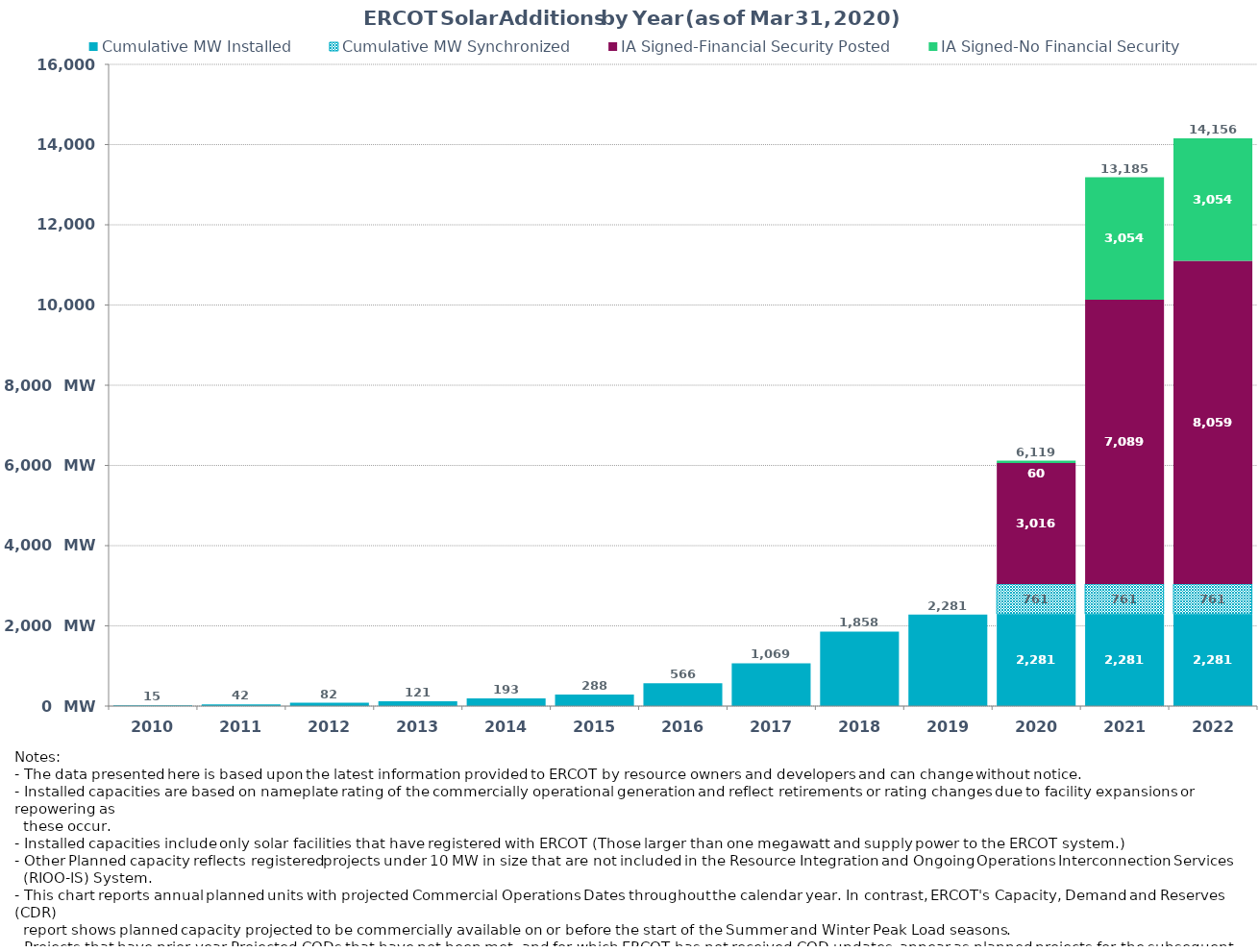
| Category | Cumulative MW Installed | Cumulative MW Synchronized | IA Signed-Financial Security Posted  | IA Signed-No Financial Security  | Other Planned | Cumulative Installed and Planned |
|---|---|---|---|---|---|---|
| 2010.0 | 15 | 0 | 0 | 0 | 0 | 15 |
| 2011.0 | 42 | 0 | 0 | 0 | 0 | 42 |
| 2012.0 | 82 | 0 | 0 | 0 | 0 | 82 |
| 2013.0 | 121 | 0 | 0 | 0 | 0 | 121 |
| 2014.0 | 193 | 0 | 0 | 0 | 0 | 193 |
| 2015.0 | 287.7 | 0 | 0 | 0 | 0 | 287.7 |
| 2016.0 | 566.4 | 0 | 0 | 0 | 0 | 566.4 |
| 2017.0 | 1068.7 | 0 | 0 | 0 | 0 | 1068.7 |
| 2018.0 | 1857.7 | 0 | 0 | 0 | 0 | 1857.7 |
| 2019.0 | 2281.4 | 0 | 0 | 0 | 0 | 2281.4 |
| 2020.0 | 2281.42 | 761.47 | 3015.87 | 60 | 0 | 6118.76 |
| 2021.0 | 2281.42 | 761.47 | 7088.53 | 3053.63 | 0 | 13185.05 |
| 2022.0 | 2281.42 | 761.47 | 8059.08 | 3053.63 | 0 | 14155.6 |